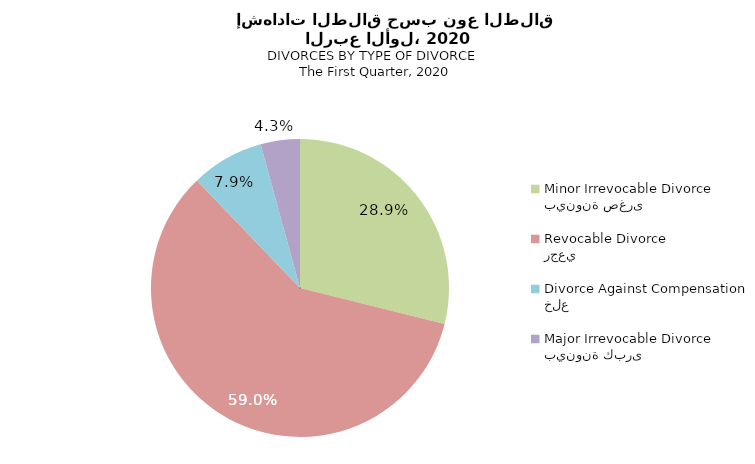
| Category | Series 1 |
|---|---|
| بينونة صغرى
Minor Irrevocable Divorce  | 28.875 |
| رجعي
Revocable Divorce  | 58.967 |
| خلع
Divorce Against Compensation | 7.903 |
| بينونة كبرى
Major Irrevocable Divorce  | 4.255 |